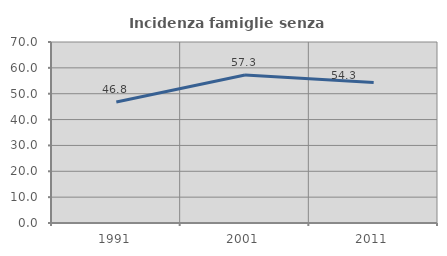
| Category | Incidenza famiglie senza nuclei |
|---|---|
| 1991.0 | 46.774 |
| 2001.0 | 57.258 |
| 2011.0 | 54.331 |